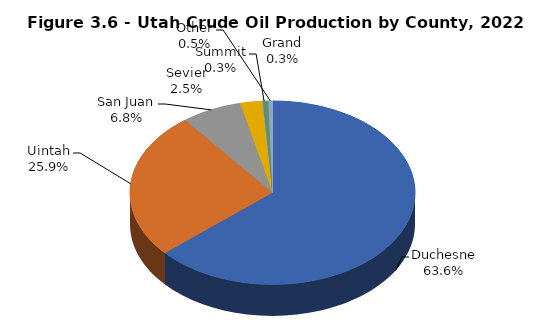
| Category | Series 0 |
|---|---|
| Duchesne | 63.588 |
| Uintah | 25.915 |
| San Juan | 6.848 |
| Sevier | 2.545 |
| Summit | 0.331 |
| Grand | 0.303 |
| Other | 0.47 |